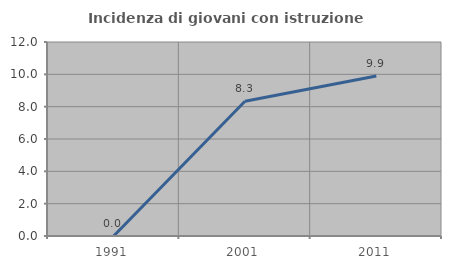
| Category | Incidenza di giovani con istruzione universitaria |
|---|---|
| 1991.0 | 0 |
| 2001.0 | 8.333 |
| 2011.0 | 9.896 |